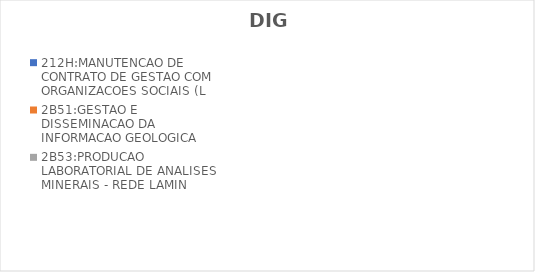
| Category | 212H:MANUTENCAO DE CONTRATO DE GESTAO COM ORGANIZACOES SOCIAIS (L | 2B51:GESTAO E DISSEMINACAO DA INFORMACAO GEOLOGICA | 2B53:PRODUCAO LABORATORIAL DE ANALISES MINERAIS - REDE LAMIN |
|---|---|---|---|
| EXECUTADO | 0 | 0.729 | 0.348 |